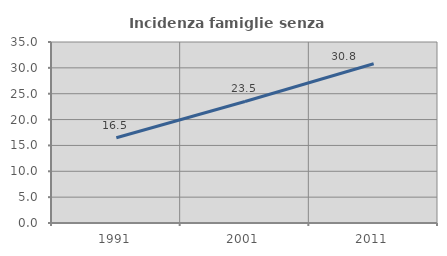
| Category | Incidenza famiglie senza nuclei |
|---|---|
| 1991.0 | 16.487 |
| 2001.0 | 23.503 |
| 2011.0 | 30.787 |